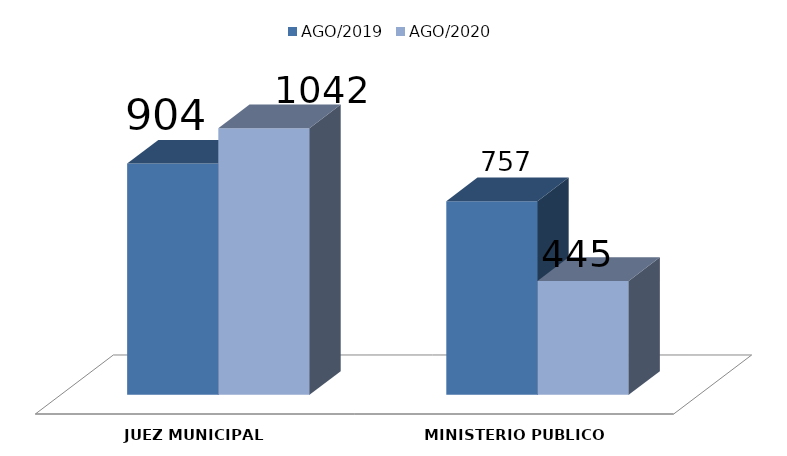
| Category | AGO/2019 | AGO/2020 |
|---|---|---|
| JUEZ MUNICIPAL | 904 | 1042 |
| MINISTERIO PUBLICO | 757 | 445 |